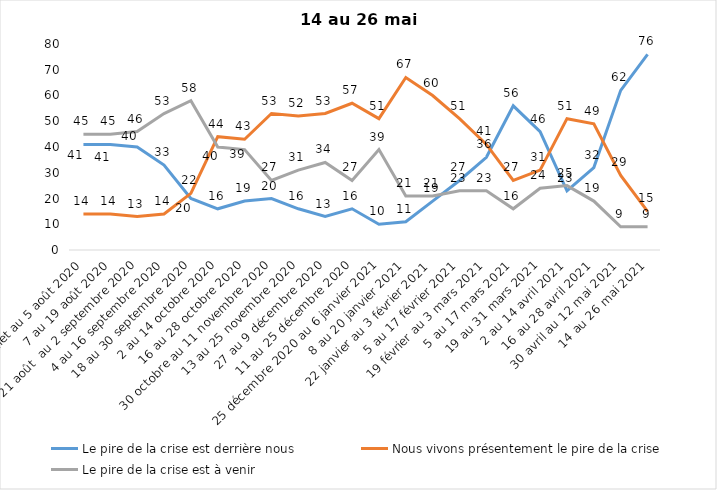
| Category | Le pire de la crise est derrière nous | Nous vivons présentement le pire de la crise | Le pire de la crise est à venir |
|---|---|---|---|
| 24 juillet au 5 août 2020 | 41 | 14 | 45 |
| 7 au 19 août 2020 | 41 | 14 | 45 |
| 21 août  au 2 septembre 2020 | 40 | 13 | 46 |
| 4 au 16 septembre 2020 | 33 | 14 | 53 |
| 18 au 30 septembre 2020 | 20 | 22 | 58 |
| 2 au 14 octobre 2020 | 16 | 44 | 40 |
| 16 au 28 octobre 2020 | 19 | 43 | 39 |
| 30 octobre au 11 novembre 2020 | 20 | 53 | 27 |
| 13 au 25 novembre 2020 | 16 | 52 | 31 |
| 27 au 9 décembre 2020 | 13 | 53 | 34 |
| 11 au 25 décembre 2020 | 16 | 57 | 27 |
| 25 décembre 2020 au 6 janvier 2021 | 10 | 51 | 39 |
| 8 au 20 janvier 2021 | 11 | 67 | 21 |
| 22 janvier au 3 février 2021 | 19 | 60 | 21 |
| 5 au 17 février 2021 | 27 | 51 | 23 |
| 19 février au 3 mars 2021 | 36 | 41 | 23 |
| 5 au 17 mars 2021 | 56 | 27 | 16 |
| 19 au 31 mars 2021 | 46 | 31 | 24 |
| 2 au 14 avril 2021 | 23 | 51 | 25 |
| 16 au 28 avril 2021 | 32 | 49 | 19 |
| 30 avril au 12 mai 2021 | 62 | 29 | 9 |
| 14 au 26 mai 2021 | 76 | 15 | 9 |